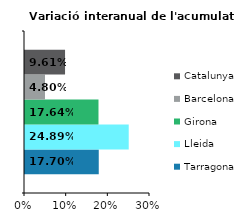
| Category | Tarragona | Lleida | Girona | Barcelona | Catalunya |
|---|---|---|---|---|---|
| 0 | 0.177 | 0.249 | 0.176 | 0.048 | 0.096 |